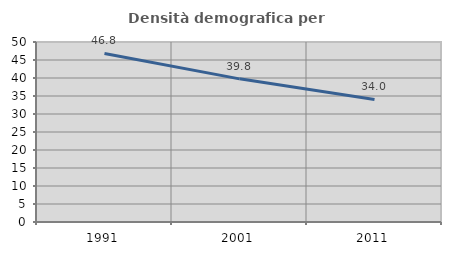
| Category | Densità demografica |
|---|---|
| 1991.0 | 46.812 |
| 2001.0 | 39.762 |
| 2011.0 | 34.039 |